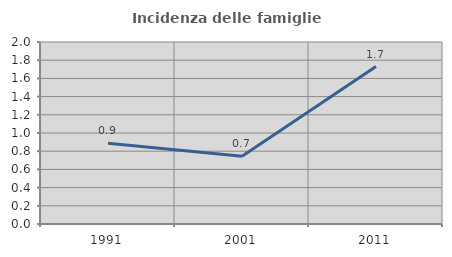
| Category | Incidenza delle famiglie numerose |
|---|---|
| 1991.0 | 0.888 |
| 2001.0 | 0.744 |
| 2011.0 | 1.73 |